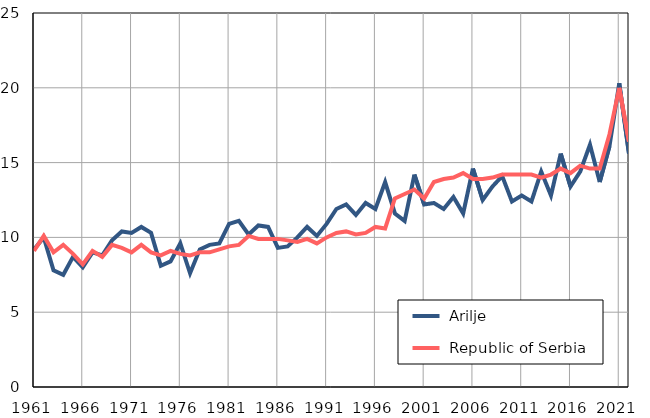
| Category |  Arilje |  Republic of Serbia |
|---|---|---|
| 1961.0 | 9.2 | 9.1 |
| 1962.0 | 10 | 10.1 |
| 1963.0 | 7.8 | 9 |
| 1964.0 | 7.5 | 9.5 |
| 1965.0 | 8.7 | 8.9 |
| 1966.0 | 8 | 8.2 |
| 1967.0 | 9 | 9.1 |
| 1968.0 | 8.8 | 8.7 |
| 1969.0 | 9.8 | 9.5 |
| 1970.0 | 10.4 | 9.3 |
| 1971.0 | 10.3 | 9 |
| 1972.0 | 10.7 | 9.5 |
| 1973.0 | 10.3 | 9 |
| 1974.0 | 8.1 | 8.8 |
| 1975.0 | 8.4 | 9.1 |
| 1976.0 | 9.6 | 8.9 |
| 1977.0 | 7.6 | 8.8 |
| 1978.0 | 9.2 | 9 |
| 1979.0 | 9.5 | 9 |
| 1980.0 | 9.6 | 9.2 |
| 1981.0 | 10.9 | 9.4 |
| 1982.0 | 11.1 | 9.5 |
| 1983.0 | 10.2 | 10.1 |
| 1984.0 | 10.8 | 9.9 |
| 1985.0 | 10.7 | 9.9 |
| 1986.0 | 9.3 | 9.9 |
| 1987.0 | 9.4 | 9.8 |
| 1988.0 | 10 | 9.7 |
| 1989.0 | 10.7 | 9.9 |
| 1990.0 | 10.1 | 9.6 |
| 1991.0 | 10.9 | 10 |
| 1992.0 | 11.9 | 10.3 |
| 1993.0 | 12.2 | 10.4 |
| 1994.0 | 11.5 | 10.2 |
| 1995.0 | 12.3 | 10.3 |
| 1996.0 | 11.9 | 10.7 |
| 1997.0 | 13.7 | 10.6 |
| 1998.0 | 11.6 | 12.6 |
| 1999.0 | 11.1 | 12.9 |
| 2000.0 | 14.2 | 13.2 |
| 2001.0 | 12.2 | 12.6 |
| 2002.0 | 12.3 | 13.7 |
| 2003.0 | 11.9 | 13.9 |
| 2004.0 | 12.7 | 14 |
| 2005.0 | 11.6 | 14.3 |
| 2006.0 | 14.6 | 13.9 |
| 2007.0 | 12.5 | 13.9 |
| 2008.0 | 13.4 | 14 |
| 2009.0 | 14.1 | 14.2 |
| 2010.0 | 12.4 | 14.2 |
| 2011.0 | 12.8 | 14.2 |
| 2012.0 | 12.4 | 14.2 |
| 2013.0 | 14.4 | 14 |
| 2014.0 | 12.8 | 14.2 |
| 2015.0 | 15.6 | 14.6 |
| 2016.0 | 13.4 | 14.3 |
| 2017.0 | 14.4 | 14.8 |
| 2018.0 | 16.2 | 14.6 |
| 2019.0 | 13.7 | 14.6 |
| 2020.0 | 16.1 | 16.9 |
| 2021.0 | 20.3 | 20 |
| 2022.0 | 15.6 | 16.4 |